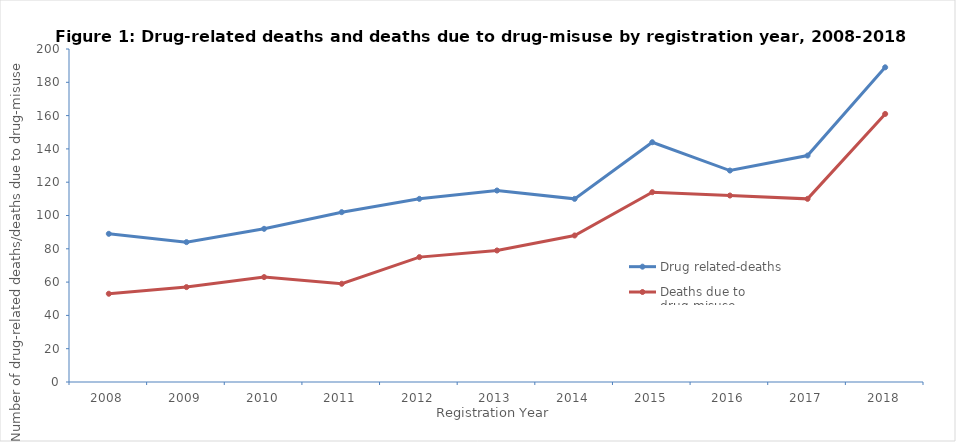
| Category | Drug related-deaths | Deaths due to drug-misuse |
|---|---|---|
| 2008.0 | 89 | 53 |
| 2009.0 | 84 | 57 |
| 2010.0 | 92 | 63 |
| 2011.0 | 102 | 59 |
| 2012.0 | 110 | 75 |
| 2013.0 | 115 | 79 |
| 2014.0 | 110 | 88 |
| 2015.0 | 144 | 114 |
| 2016.0 | 127 | 112 |
| 2017.0 | 136 | 110 |
| 2018.0 | 189 | 161 |